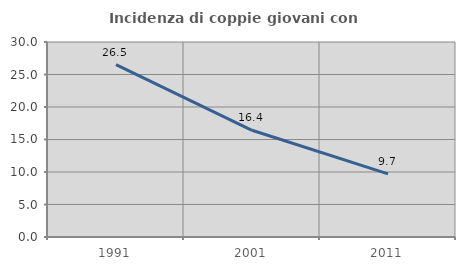
| Category | Incidenza di coppie giovani con figli |
|---|---|
| 1991.0 | 26.527 |
| 2001.0 | 16.419 |
| 2011.0 | 9.721 |